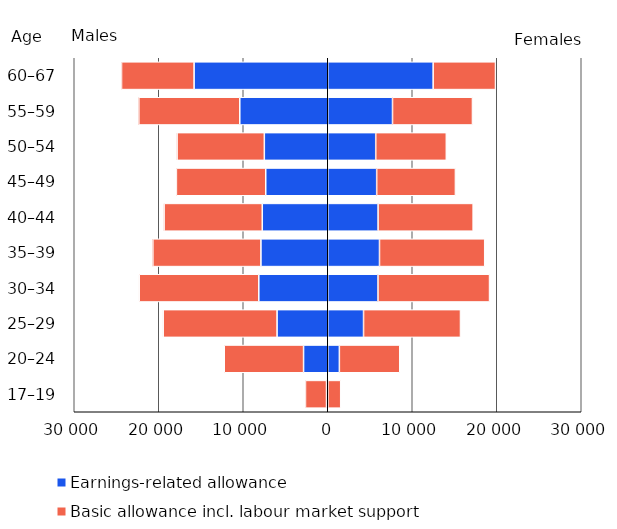
| Category | Series 0 | Series 1 | Earnings-related allowance | Basic allowance incl. labour market support |
|---|---|---|---|---|
| 17–19 | -145 | -2491 | 15 | 1518 |
| 20–24 | -2862 | -9385 | 1374 | 7146 |
| 25–29 | -5998 | -13475 | 4236 | 11473 |
| 30–34 | -8160 | -14151 | 5945 | 13201 |
| 35–39 | -7907 | -12790 | 6123 | 12452 |
| 40–44 | -7749 | -11618 | 5956 | 11250 |
| 45–49 | -7338 | -10575 | 5790 | 9319 |
| 50–54 | -7505 | -10324 | 5678 | 8354 |
| 55–59 | -10410 | -11947 | 7663 | 9462 |
| 60–67 | -15819 | -8586 | 12475 | 7377 |